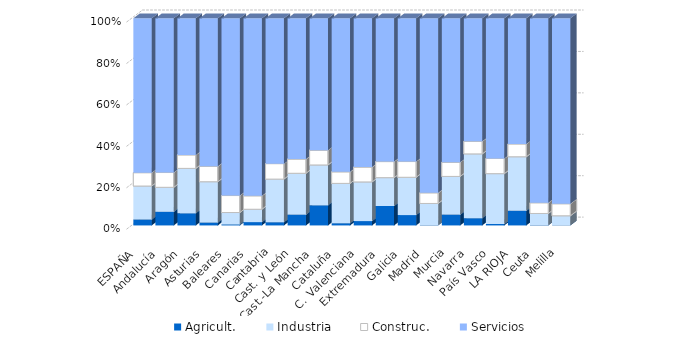
| Category | Agricult. | Industria | Construc. | Servicios |
|---|---|---|---|---|
| ESPAÑA | 2.883 | 16.147 | 6.431 | 74.539 |
| Andalucía | 6.581 | 11.829 | 7.135 | 74.455 |
| Aragón | 5.88 | 21.662 | 6.507 | 65.951 |
| Asturias | 1.412 | 19.686 | 7.427 | 71.475 |
| Baleares | 0.527 | 5.71 | 8.201 | 85.562 |
| Canarias | 1.624 | 6.198 | 6.466 | 85.712 |
| Cantabria | 1.564 | 20.804 | 7.474 | 70.158 |
| Cast. y León | 5.202 | 19.981 | 6.834 | 67.983 |
| Cast.-La Mancha | 9.737 | 19.456 | 7.148 | 63.658 |
| Cataluña | 1.076 | 19.23 | 5.557 | 74.138 |
| C. Valenciana | 2.116 | 18.884 | 7.156 | 71.844 |
| Extremadura | 9.384 | 13.681 | 7.765 | 69.17 |
| Galicia | 5.013 | 18.239 | 7.602 | 69.146 |
| Madrid | 0.09 | 10.52 | 5.127 | 84.263 |
| Murcia | 5.215 | 18.455 | 6.834 | 69.495 |
| Navarra | 3.524 | 31.006 | 6.073 | 59.396 |
| País Vasco | 0.684 | 24.315 | 7.32 | 67.681 |
| LA RIOJA | 7.07 | 26.078 | 6.179 | 60.673 |
| Ceuta | 0.1 | 5.673 | 5.164 | 89.063 |
| Melilla | 0.041 | 4.613 | 5.816 | 89.53 |